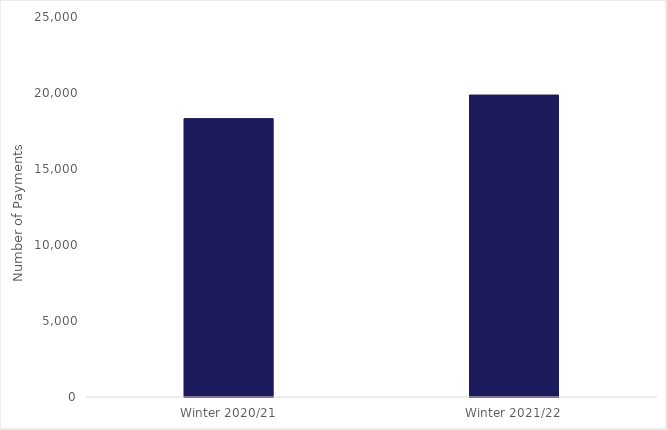
| Category | Number of Payments |
|---|---|
| Winter 2020/21 | 18315 |
| Winter 2021/22 | 19865 |